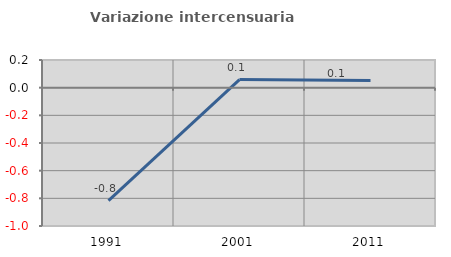
| Category | Variazione intercensuaria annua |
|---|---|
| 1991.0 | -0.817 |
| 2001.0 | 0.059 |
| 2011.0 | 0.053 |